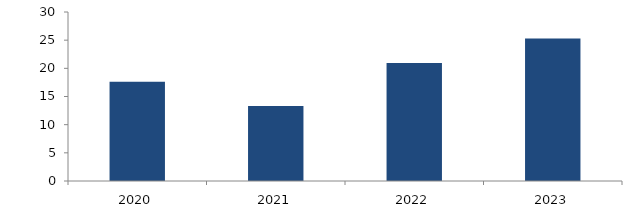
| Category | Bogotá |
|---|---|
| 2020.0 | 17.64 |
| 2021.0 | 13.293 |
| 2022.0 | 20.962 |
| 2023.0 | 25.281 |